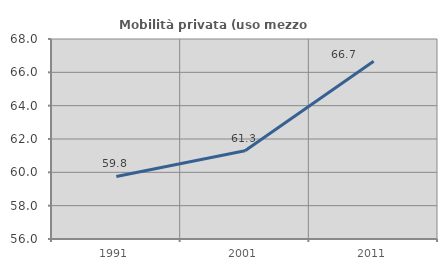
| Category | Mobilità privata (uso mezzo privato) |
|---|---|
| 1991.0 | 59.753 |
| 2001.0 | 61.298 |
| 2011.0 | 66.667 |